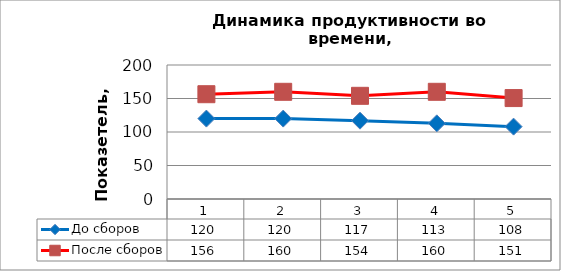
| Category | До сборов | После сборов |
|---|---|---|
| 0 | 120 | 156.4 |
| 1 | 120 | 160 |
| 2 | 116.923 | 154 |
| 3 | 112.941 | 160 |
| 4 | 108 | 150.652 |